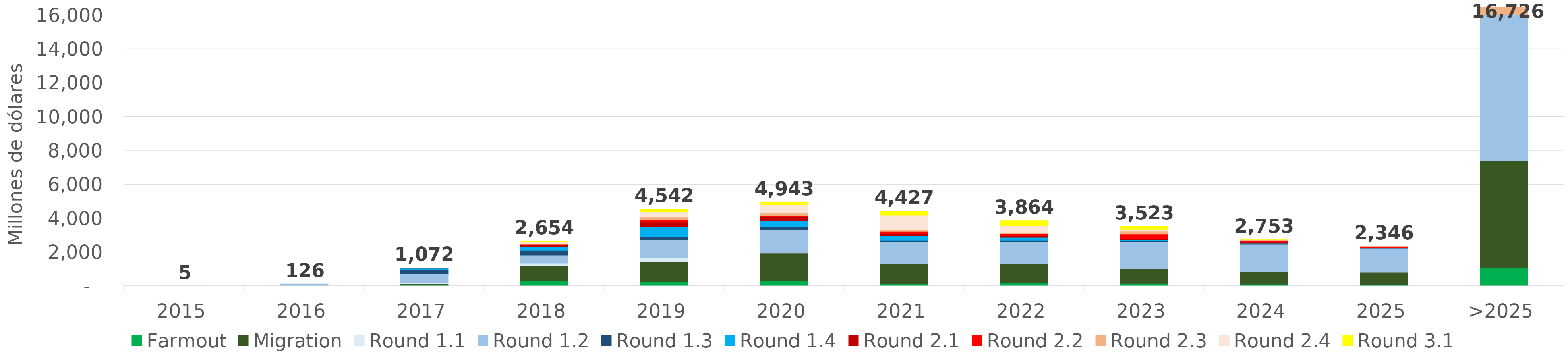
| Category | Farmout | Migration | Round 1.1 | Round 1.2 | Round 1.3 | Round 1.4 | Round 2.1 | Round 2.2 | Round 2.3 | Round 2.4 | Round 3.1 |
|---|---|---|---|---|---|---|---|---|---|---|---|
| 2015 | 0 | 0 | 4.573 | 0.236 | 0 | 0 | 0 | 0 | 0 | 0 | 0 |
| 2016 | 0 | 0 | 16.79 | 108.909 | 0 | 0 | 0 | 0 | 0 | 0 | 0 |
| 2017 | 50.877 | 65.422 | 76.429 | 533.486 | 231.789 | 93.443 | 18.851 | 1.29 | 0.72 | 0 | 0 |
| 2018 | 289.394 | 902.921 | 155.042 | 470.128 | 278.302 | 226.903 | 104.896 | 21.902 | 26.974 | 139.641 | 37.691 |
| 2019 | 241.207 | 1195.818 | 236.68 | 1049.68 | 207.126 | 540.649 | 302.09 | 133.009 | 199.161 | 270.262 | 166.186 |
| 2020 | 284.321 | 1655.641 | 6.736 | 1382.287 | 161.213 | 341.057 | 252.645 | 70.216 | 163.112 | 477.469 | 148.013 |
| 2021 | 127.797 | 1192.243 | 2.229 | 1284.713 | 97.796 | 274.593 | 106.762 | 133.184 | 98.223 | 870.647 | 238.989 |
| 2022 | 194.279 | 1133.929 | 0 | 1296.527 | 77.18 | 171.379 | 108.625 | 90.894 | 70.555 | 397.454 | 323.017 |
| 2023 | 149.166 | 876.4 | 0 | 1577.797 | 82.915 | 59.302 | 27.746 | 292.274 | 167.685 | 104.985 | 184.454 |
| 2024 | 102.681 | 719.78 | 0 | 1631.366 | 57.216 | 10.68 | 91.044 | 70.674 | 65.551 | 1.529 | 2.805 |
| 2025 | 89.748 | 719.885 | 0 | 1409.554 | 37.877 | 5.238 | 2.607 | 36.334 | 44.551 | 0 | 0 |
| >2025 | 1066.13 | 6325.095 | 0 | 8701.578 | 310.453 | 0 | 0 | 95.608 | 226.914 | 0 | 0 |